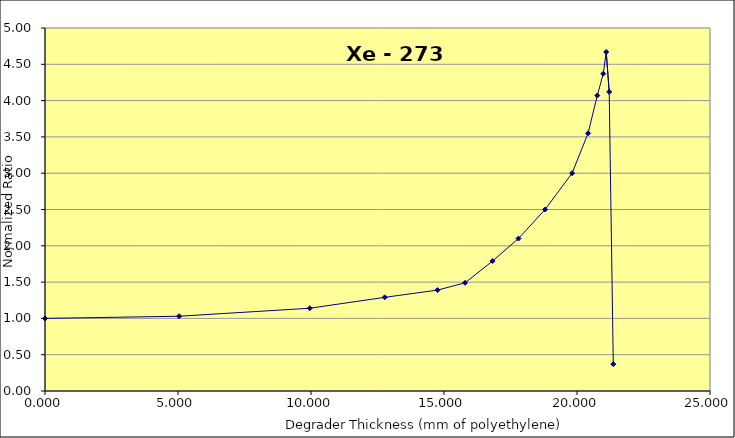
| Category | Series 0 |
|---|---|
| 0.0 | 1 |
| 5.044 | 1.03 |
| 9.954 | 1.14 |
| 12.77 | 1.29 |
| 14.759 | 1.39 |
| 15.793 | 1.49 |
| 16.826 | 1.79 |
| 17.8 | 2.1 |
| 18.8 | 2.5 |
| 19.815 | 3 |
| 20.416 | 3.55 |
| 20.763 | 4.07 |
| 20.987 | 4.37 |
| 21.098 | 4.67 |
| 21.211 | 4.12 |
| 21.364 | 0.37 |